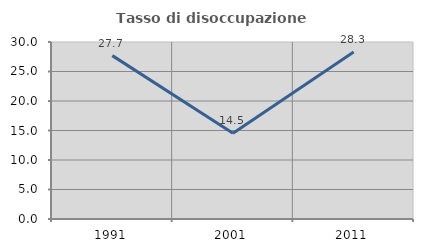
| Category | Tasso di disoccupazione giovanile  |
|---|---|
| 1991.0 | 27.692 |
| 2001.0 | 14.545 |
| 2011.0 | 28.302 |